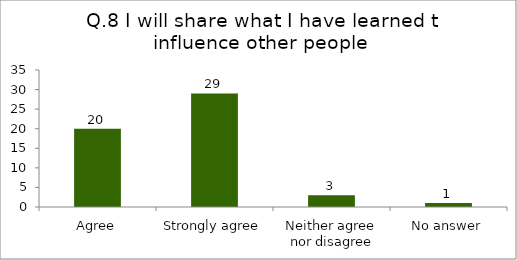
| Category | Q.8 I will share what I have learned ti influence other people |
|---|---|
| Agree | 20 |
| Strongly agree | 29 |
| Neither agree nor disagree | 3 |
| No answer | 1 |